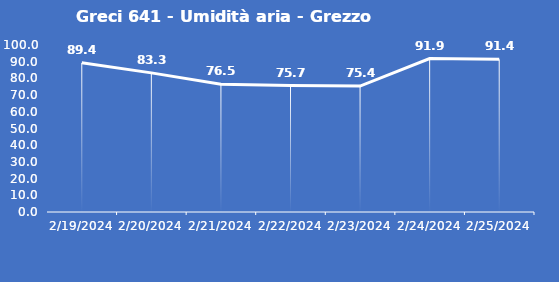
| Category | Greci 641 - Umidità aria - Grezzo (%) |
|---|---|
| 2/19/24 | 89.4 |
| 2/20/24 | 83.3 |
| 2/21/24 | 76.5 |
| 2/22/24 | 75.7 |
| 2/23/24 | 75.4 |
| 2/24/24 | 91.9 |
| 2/25/24 | 91.4 |